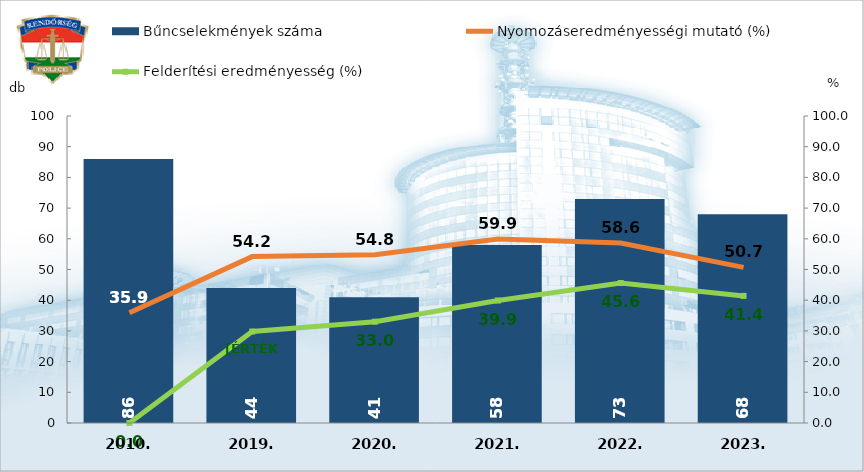
| Category | Bűncselekmények száma |
|---|---|
| 2010. | 86 |
| 2019. | 44 |
| 2020. | 41 |
| 2021. | 58 |
| 2022. | 73 |
| 2023. | 68 |